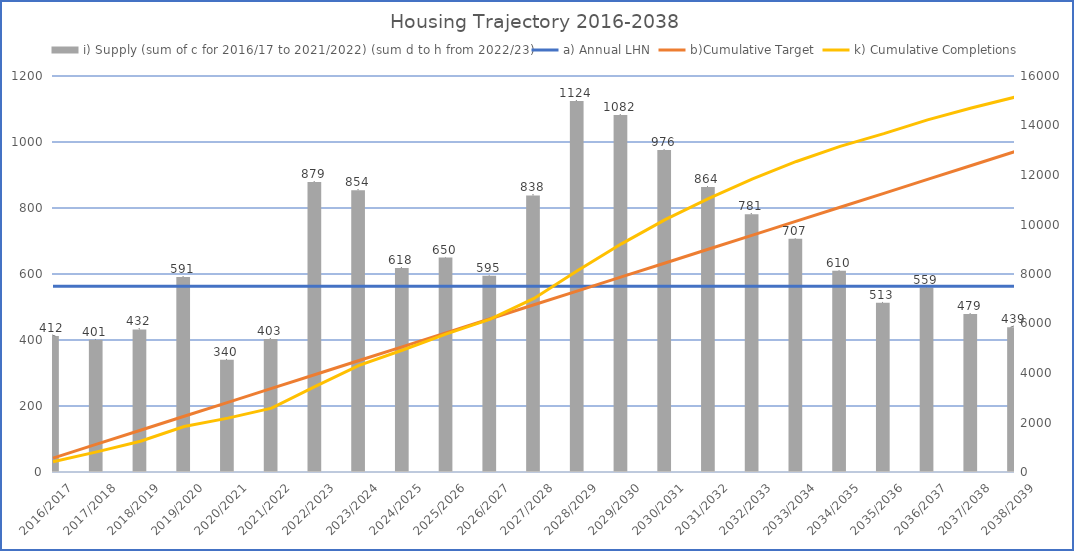
| Category | i) Supply (sum of c for 2016/17 to 2021/2022) (sum d to h from 2022/23) |
|---|---|
| 2016/2017 | 412 |
| 2017/2018 | 401 |
| 2018/2019 | 432 |
| 2019/2020 | 591 |
| 2020/2021 | 340 |
| 2021/2022 | 403 |
| 2022/2023 | 879 |
| 2023/2024 | 854 |
| 2024/2025 | 618 |
| 2025/2026 | 650 |
| 2026/2027 | 595 |
| 2027/2028 | 838 |
| 2028/2029 | 1124 |
| 2029/2030 | 1082 |
| 2030/2031 | 976 |
| 2031/2032 | 864 |
| 2032/2033 | 781 |
| 2033/2034 | 707 |
| 2034/2035 | 610 |
| 2035/2036 | 513 |
| 2036/2037 | 559 |
| 2037/2038 | 479 |
| 2038/2039 | 439 |